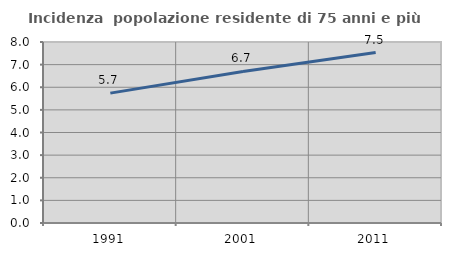
| Category | Incidenza  popolazione residente di 75 anni e più |
|---|---|
| 1991.0 | 5.741 |
| 2001.0 | 6.7 |
| 2011.0 | 7.533 |